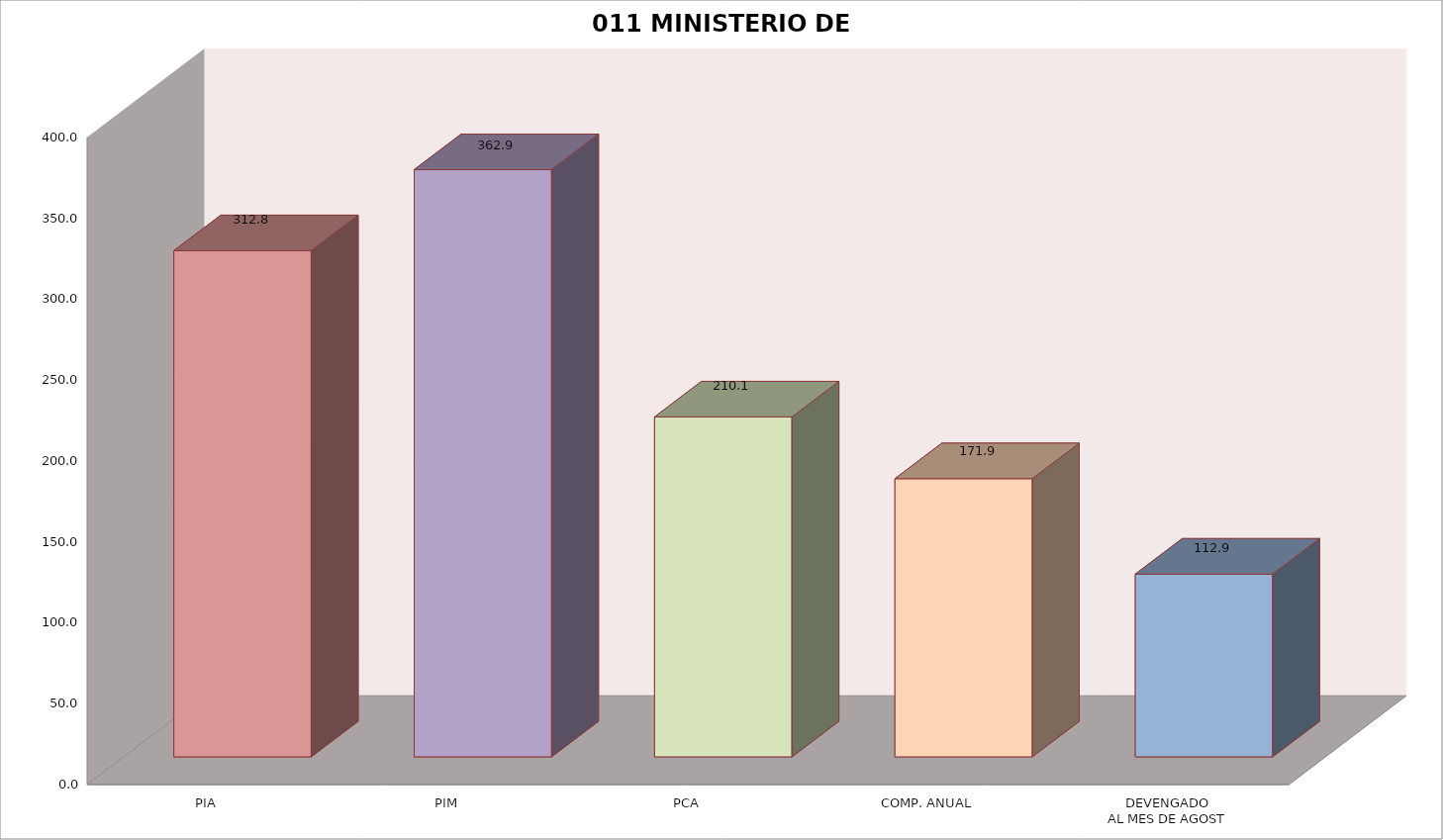
| Category | 011 MINISTERIO DE SALUD |
|---|---|
| PIA | 312.801 |
| PIM | 362.893 |
| PCA | 210.073 |
| COMP. ANUAL | 171.911 |
| DEVENGADO
AL MES DE AGOST | 112.947 |